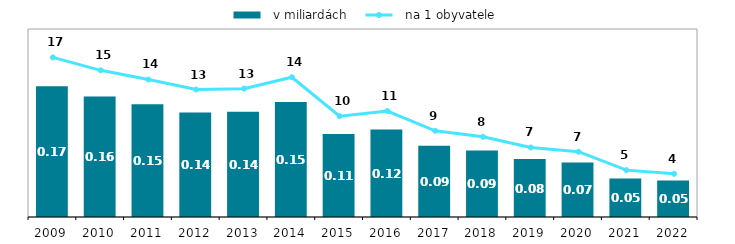
| Category |   v miliardách |
|---|---|
| 2009.0 | 0.174 |
| 2010.0 | 0.16 |
| 2011.0 | 0.15 |
| 2012.0 | 0.139 |
| 2013.0 | 0.14 |
| 2014.0 | 0.153 |
| 2015.0 | 0.11 |
| 2016.0 | 0.116 |
| 2017.0 | 0.095 |
| 2018.0 | 0.089 |
| 2019.0 | 0.077 |
| 2020.0 | 0.072 |
| 2021.0 | 0.051 |
| 2022.0 | 0.048 |